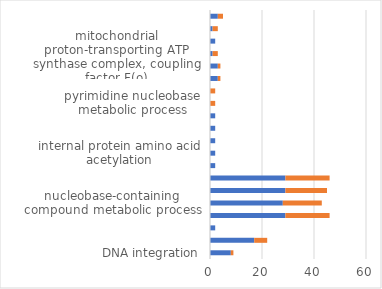
| Category | UP | down |
|---|---|---|
| DNA integration | 8 | 1 |
| DNA metabolic process | 17 | 5 |
| alpha-tubulin acetylation | 2 | 0 |
| cellular aromatic compound metabolic process | 29 | 17 |
| nucleobase-containing compound metabolic process | 28 | 15 |
| heterocycle metabolic process | 29 | 16 |
| organic cyclic compound metabolic process | 29 | 17 |
| protein acetylation | 2 | 0 |
| internal protein amino acid acetylation | 2 | 0 |
| internal peptidyl-lysine acetylation | 2 | 0 |
| peptidyl-lysine acetylation | 2 | 0 |
| protein acylation | 2 | 0 |
| pyrimidine nucleobase metabolic process | 0 | 2 |
| pyrimidine nucleobase biosynthetic process | 0 | 2 |
| transposition, DNA-mediated | 3 | 1 |
| transposition | 3 | 1 |
| mitochondrial proton-transporting ATP synthase complex, coupling factor F(o) | 1 | 2 |
| tubulin N-acetyltransferase activity | 2 | 0 |
| neuropeptide hormone activity | 1 | 2 |
| hormone activity | 3 | 2 |